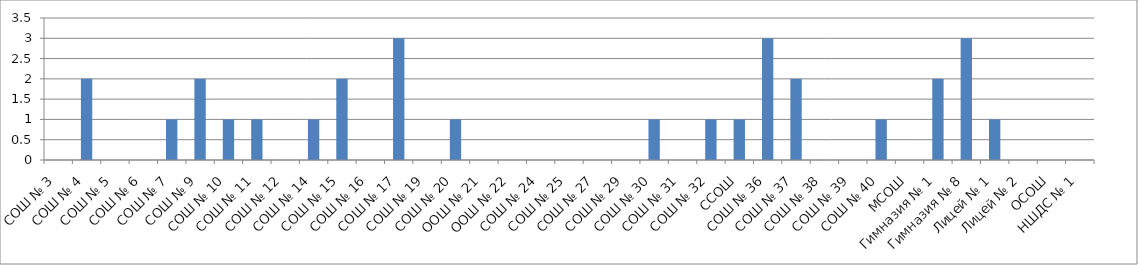
| Category | Series 0 |
|---|---|
| СОШ № 3 | 0 |
| СОШ № 4 | 2 |
| СОШ № 5 | 0 |
| СОШ № 6 | 0 |
| СОШ № 7 | 1 |
| СОШ № 9 | 2 |
| СОШ № 10 | 1 |
| СОШ № 11 | 1 |
| СОШ № 12 | 0 |
| СОШ № 14 | 1 |
| СОШ № 15 | 2 |
| СОШ № 16 | 0 |
| СОШ № 17 | 3 |
| СОШ № 19 | 0 |
| СОШ № 20 | 1 |
| ООШ № 21 | 0 |
| ООШ № 22 | 0 |
| СОШ № 24 | 0 |
| СОШ № 25 | 0 |
| СОШ № 27 | 0 |
| СОШ № 29 | 0 |
| СОШ № 30 | 1 |
| СОШ № 31 | 0 |
| СОШ № 32 | 1 |
| ССОШ | 1 |
| СОШ № 36 | 3 |
| СОШ № 37 | 2 |
| СОШ № 38 | 0 |
| СОШ № 39 | 0 |
| СОШ № 40 | 1 |
| МСОШ | 0 |
| Гимназия № 1 | 2 |
| Гимназия № 8 | 3 |
| Лицей № 1 | 1 |
| Лицей № 2 | 0 |
| ОСОШ | 0 |
| НШДС № 1 | 0 |